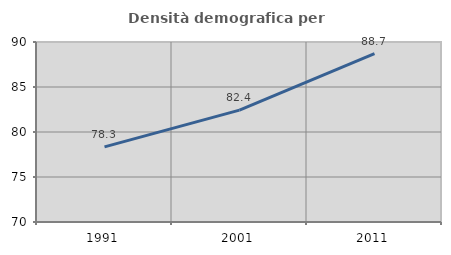
| Category | Densità demografica |
|---|---|
| 1991.0 | 78.346 |
| 2001.0 | 82.43 |
| 2011.0 | 88.704 |